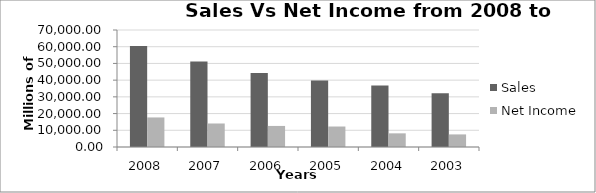
| Category | Sales | Net Income |
|---|---|---|
| 2008.0 | 60420 | 17681 |
| 2007.0 | 51122 | 14065 |
| 2006.0 | 44282 | 12599 |
| 2005.0 | 39788 | 12254 |
| 2004.0 | 36835 | 8168 |
| 2003.0 | 32187 | 7531 |